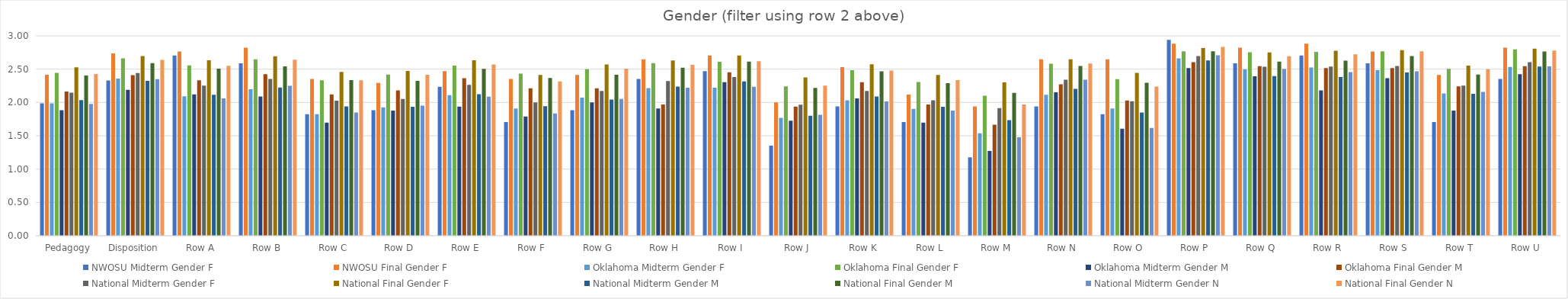
| Category | NWOSU | Oklahoma | National |
|---|---|---|---|
| Pedagogy | 2.416 | 2.166 | 2.428 |
| Disposition | 2.735 | 2.409 | 2.64 |
| Row A | 2.765 | 2.333 | 2.549 |
| Row B | 2.824 | 2.424 | 2.642 |
| Row C | 2.353 | 2.121 | 2.334 |
| Row D | 2.294 | 2.182 | 2.415 |
| Row E | 2.471 | 2.364 | 2.572 |
| Row F | 2.353 | 2.212 | 2.317 |
| Row G | 2.412 | 2.212 | 2.508 |
| Row H | 2.647 | 1.97 | 2.565 |
| Row I | 2.706 | 2.454 | 2.62 |
| Row J | 2 | 1.939 | 2.254 |
| Row K | 2.529 | 2.303 | 2.479 |
| Row L | 2.118 | 1.97 | 2.335 |
| Row M | 1.941 | 1.667 | 1.969 |
| Row N | 2.647 | 2.273 | 2.584 |
| Row O | 2.647 | 2.03 | 2.238 |
| Row P | 2.882 | 2.606 | 2.833 |
| Row Q | 2.824 | 2.546 | 2.693 |
| Row R | 2.882 | 2.515 | 2.723 |
| Row S | 2.765 | 2.515 | 2.769 |
| Row T | 2.412 | 2.242 | 2.499 |
| Row U | 2.824 | 2.546 | 2.78 |